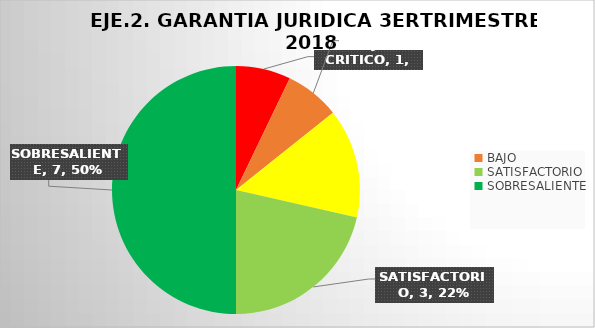
| Category | Series 0 |
|---|---|
| CRITICO | 1 |
| BAJO | 1 |
| MEDIO | 2 |
| SATISFACTORIO | 3 |
| SOBRESALIENTE | 7 |